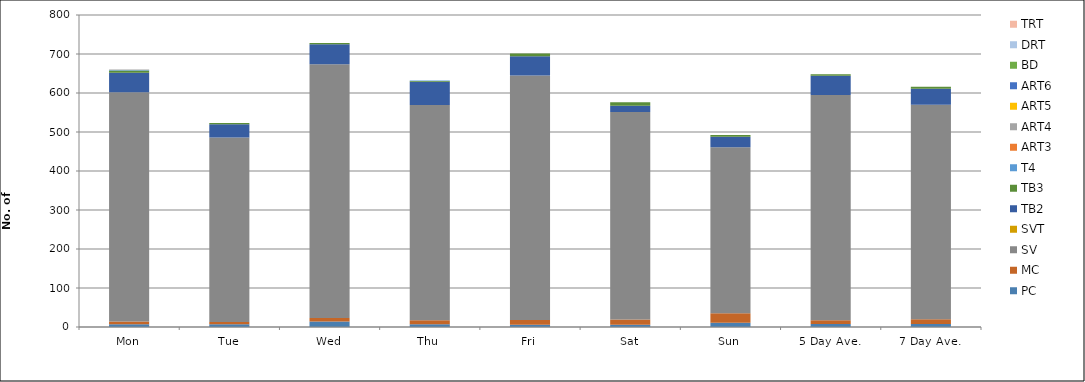
| Category | PC | MC | SV | SVT | TB2 | TB3 | T4 | ART3 | ART4 | ART5 | ART6 | BD | DRT | TRT |
|---|---|---|---|---|---|---|---|---|---|---|---|---|---|---|
| Mon | 7 | 7 | 588 | 0 | 50 | 6 | 1 | 0 | 1 | 0 | 0 | 0 | 0 | 0 |
| Tue | 7 | 6 | 473 | 0 | 34 | 3 | 0 | 0 | 0 | 0 | 0 | 0 | 0 | 0 |
| Wed | 14 | 9 | 651 | 0 | 51 | 3 | 0 | 0 | 0 | 0 | 0 | 0 | 0 | 0 |
| Thu | 7 | 10 | 552 | 0 | 60 | 2 | 1 | 0 | 0 | 0 | 0 | 0 | 0 | 0 |
| Fri | 6 | 12 | 627 | 0 | 49 | 7 | 0 | 0 | 0 | 0 | 0 | 0 | 0 | 0 |
| Sat | 6 | 13 | 532 | 0 | 16 | 9 | 0 | 0 | 0 | 0 | 0 | 0 | 0 | 0 |
| Sun | 11 | 24 | 426 | 0 | 27 | 4 | 0 | 0 | 0 | 0 | 0 | 0 | 0 | 0 |
| 5 Day Ave. | 8 | 9 | 578 | 0 | 49 | 4 | 0 | 0 | 0 | 0 | 0 | 0 | 0 | 0 |
| 7 Day Ave. | 8 | 12 | 550 | 0 | 41 | 5 | 0 | 0 | 0 | 0 | 0 | 0 | 0 | 0 |